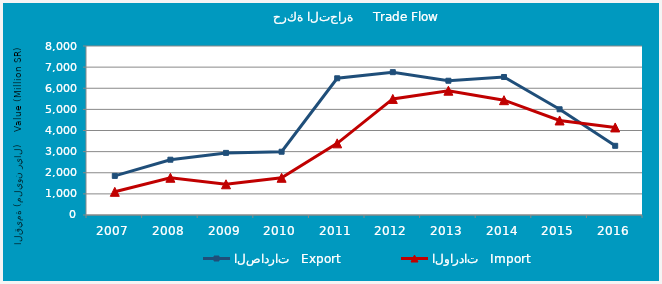
| Category | الصادرات   Export | الواردات   Import |
|---|---|---|
| 2007.0 | 1851.174 | 1096.997 |
| 2008.0 | 2617.451 | 1762.488 |
| 2009.0 | 2940.23 | 1453.409 |
| 2010.0 | 2995.223 | 1761.556 |
| 2011.0 | 6471.285 | 3391.882 |
| 2012.0 | 6761.592 | 5493.367 |
| 2013.0 | 6355.373 | 5883.363 |
| 2014.0 | 6532.768 | 5435.375 |
| 2015.0 | 5004.714 | 4474.251 |
| 2016.0 | 3275.427 | 4144.485 |